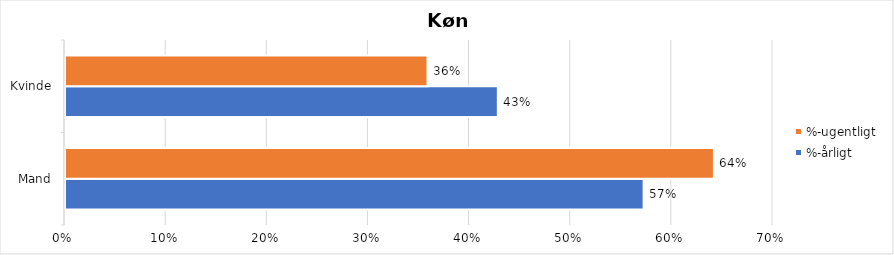
| Category | %-årligt | %-ugentligt |
|---|---|---|
| Mand | 0.572 | 0.642 |
| Kvinde | 0.428 | 0.358 |